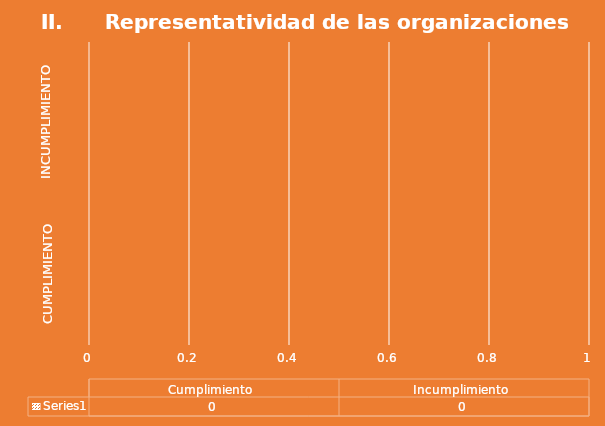
| Category | Series 0 |
|---|---|
| Cumplimiento  | 0 |
| Incumplimiento  | 0 |